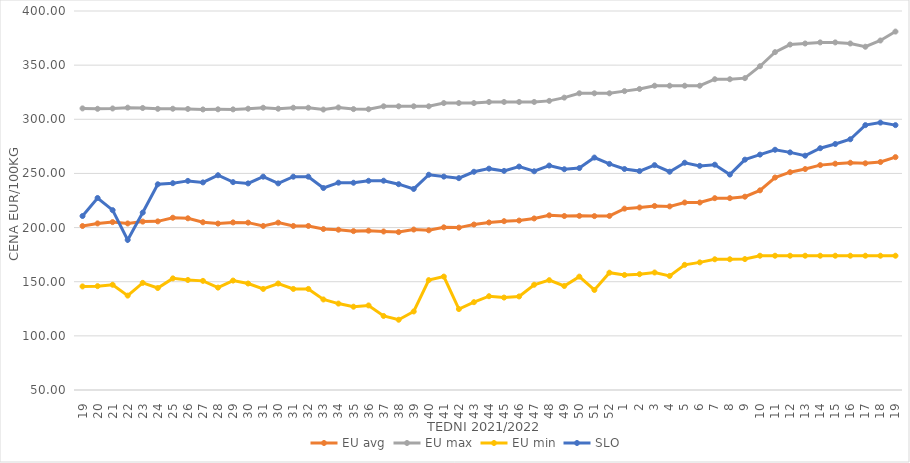
| Category | EU avg | EU max | EU min | SLO |
|---|---|---|---|---|
| 19.0 | 201.439 | 310.06 | 145.644 | 210.68 |
| 20.0 | 203.834 | 309.69 | 145.911 | 227.32 |
| 21.0 | 205.04 | 309.99 | 147.188 | 216.08 |
| 22.0 | 203.79 | 310.76 | 137.177 | 188.6 |
| 23.0 | 205.51 | 310.41 | 148.928 | 213.84 |
| 24.0 | 205.73 | 309.64 | 144.161 | 239.99 |
| 25.0 | 209.095 | 309.74 | 153.081 | 240.99 |
| 26.0 | 208.551 | 309.55 | 151.599 | 243.11 |
| 27.0 | 204.914 | 309.08 | 150.789 | 241.72 |
| 28.0 | 203.681 | 309.21 | 144.56 | 248.33 |
| 29.0 | 204.773 | 309.15 | 151.052 | 241.96 |
| 30.0 | 204.558 | 309.78 | 148.33 | 240.79 |
| 31.0 | 201.483 | 310.67 | 143.33 | 247 |
| 30.0 | 204.558 | 309.78 | 148.33 | 240.79 |
| 31.0 | 201.483 | 310.67 | 143.33 | 247 |
| 32.0 | 201.483 | 310.67 | 143.33 | 247 |
| 33.0 | 198.691 | 309 | 133.607 | 236.54 |
| 34.0 | 198.027 | 310.9 | 129.797 | 241.45 |
| 35.0 | 196.72 | 309.41 | 126.926 | 241.39 |
| 36.0 | 197.157 | 309.28 | 128.099 | 243.19 |
| 37.0 | 196.375 | 312 | 118.364 | 243.28 |
| 38.0 | 195.821 | 312 | 114.892 | 240.06 |
| 39.0 | 198.179 | 312 | 122.517 | 235.66 |
| 40.0 | 197.482 | 312 | 151.488 | 248.77 |
| 41.0 | 200.22 | 315 | 154.74 | 247.07 |
| 42.0 | 199.965 | 315 | 124.748 | 245.64 |
| 43.0 | 202.804 | 315 | 131.104 | 251.53 |
| 44.0 | 204.713 | 316 | 136.6 | 254.42 |
| 45.0 | 205.906 | 316 | 135.362 | 252.35 |
| 46.0 | 206.476 | 316 | 136.39 | 256.33 |
| 47.0 | 208.415 | 316 | 147.192 | 252.01 |
| 48.0 | 211.314 | 317 | 151.41 | 257.25 |
| 49.0 | 210.677 | 320 | 146.064 | 253.87 |
| 50.0 | 210.823 | 324 | 154.698 | 254.94 |
| 51.0 | 210.59 | 324 | 142.382 | 264.65 |
| 52.0 | 210.763 | 324 | 158.333 | 258.8 |
| 1.0 | 217.49 | 326 | 156.222 | 254.09 |
| 2.0 | 218.55 | 328 | 156.969 | 252.15 |
| 3.0 | 219.967 | 331 | 158.511 | 257.65 |
| 4.0 | 219.57 | 331 | 155.346 | 251.6 |
| 5.0 | 223.136 | 331 | 165.59 | 259.87 |
| 6.0 | 223.143 | 331 | 167.86 | 256.97 |
| 7.0 | 227.138 | 337 | 170.719 | 258.07 |
| 8.0 | 227.191 | 337 | 170.743 | 248.97 |
| 9.0 | 228.512 | 338 | 170.92 | 262.72 |
| 10.0 | 234.369 | 349 | 174 | 267.38 |
| 11.0 | 246.205 | 362 | 174 | 271.86 |
| 12.0 | 251.132 | 369 | 174 | 269.43 |
| 13.0 | 254.061 | 370 | 174 | 266.39 |
| 14.0 | 257.672 | 371 | 174 | 273.3 |
| 15.0 | 258.997 | 371 | 174 | 277.18 |
| 16.0 | 259.87 | 370 | 174 | 281.55 |
| 17.0 | 259.346 | 367 | 174 | 294.59 |
| 18.0 | 260.525 | 372.758 | 174 | 296.93 |
| 19.0 | 265.053 | 381 | 174 | 294.6 |